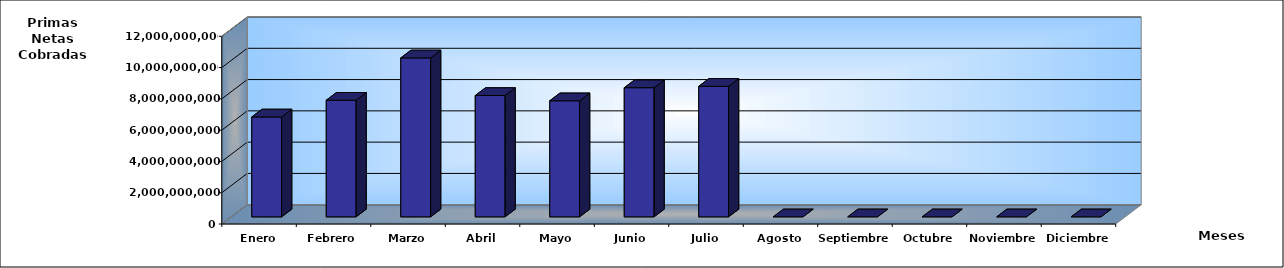
| Category | Series 0 |
|---|---|
| Enero | 6386339260.41 |
| Febrero | 7455778580.88 |
| Marzo | 10161183389.08 |
| Abril | 7756182761.13 |
| Mayo | 7420501428.8 |
| Junio | 8257043153.85 |
| Julio | 8345607684.27 |
| Agosto | 0 |
| Septiembre | 0 |
| Octubre | 0 |
| Noviembre | 0 |
| Diciembre | 0 |